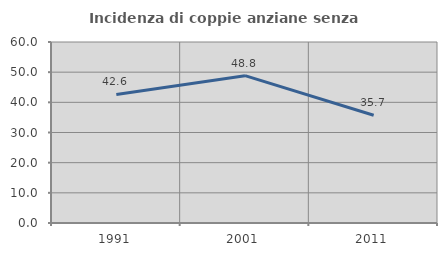
| Category | Incidenza di coppie anziane senza figli  |
|---|---|
| 1991.0 | 42.623 |
| 2001.0 | 48.837 |
| 2011.0 | 35.714 |